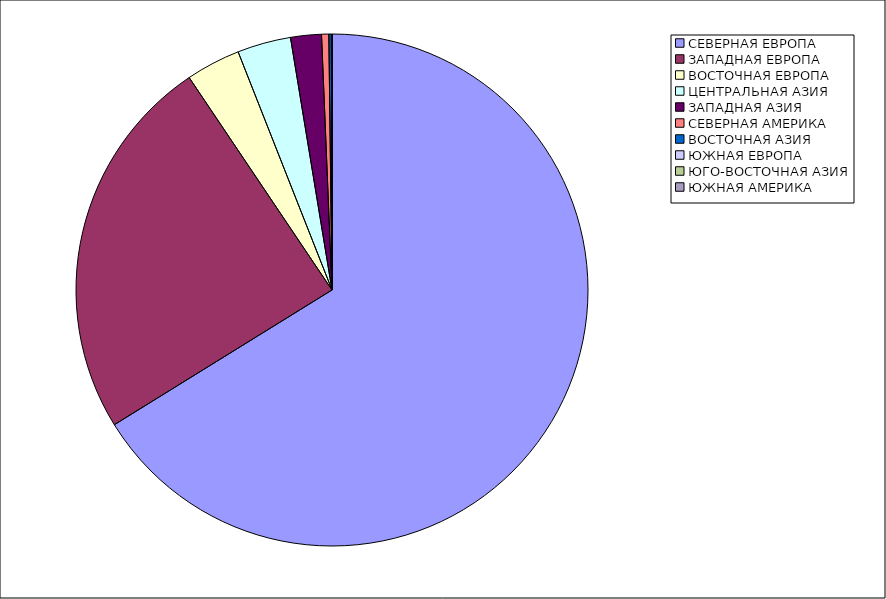
| Category | Оборот |
|---|---|
| СЕВЕРНАЯ ЕВРОПА | 66.178 |
| ЗАПАДНАЯ ЕВРОПА | 24.4 |
| ВОСТОЧНАЯ ЕВРОПА | 3.445 |
| ЦЕНТРАЛЬНАЯ АЗИЯ | 3.38 |
| ЗАПАДНАЯ АЗИЯ | 1.943 |
| СЕВЕРНАЯ АМЕРИКА | 0.457 |
| ВОСТОЧНАЯ АЗИЯ | 0.156 |
| ЮЖНАЯ ЕВРОПА | 0.039 |
| ЮГО-ВОСТОЧНАЯ АЗИЯ | 0.001 |
| ЮЖНАЯ АМЕРИКА | 0 |